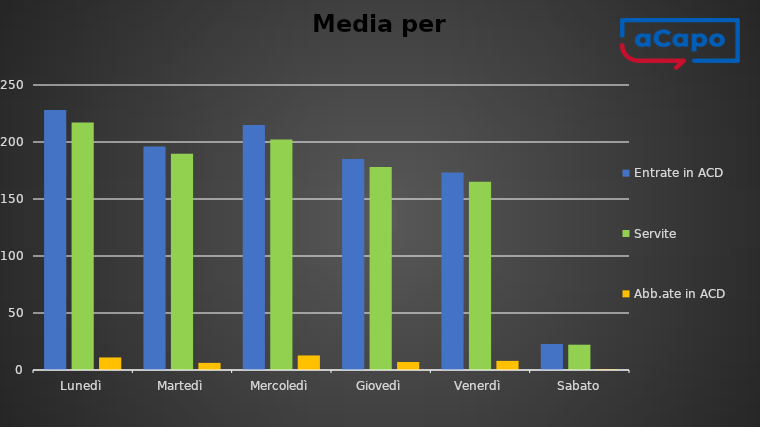
| Category | Entrate in ACD | Servite | Abb.ate in ACD |
|---|---|---|---|
| Lunedì | 228 | 217 | 11 |
| Martedì | 196 | 189.75 | 6.25 |
| Mercoledì | 215 | 202.25 | 12.75 |
| Giovedì | 185 | 178 | 7 |
| Venerdì | 173.2 | 165.2 | 8 |
| Sabato | 22.8 | 22.2 | 0.6 |